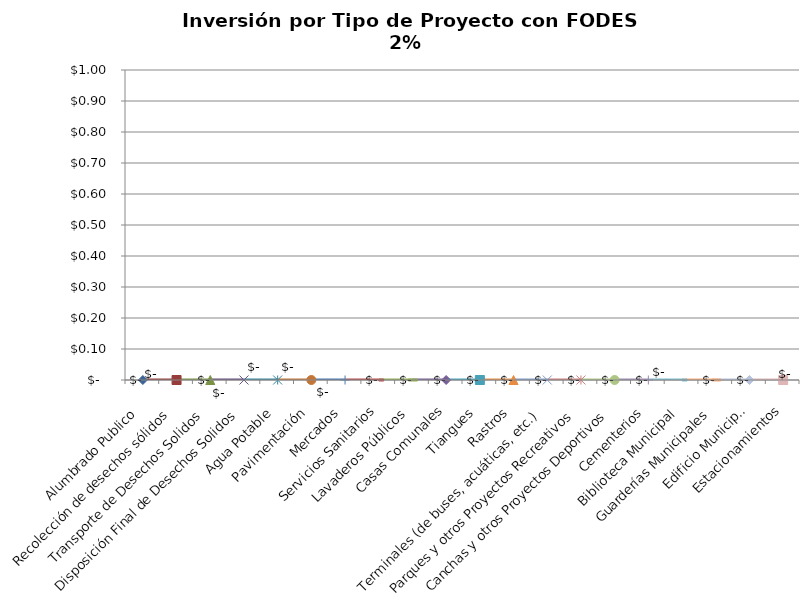
| Category | Series 0 |
|---|---|
| Alumbrado Publico | 0 |
| Recolección de desechos sólidos | 0 |
| Transporte de Desechos Solidos | 0 |
| Disposición Final de Desechos Solidos | 0 |
| Agua Potable | 0 |
| Pavimentación | 0 |
| Mercados | 0 |
| Servicios Sanitarios | 0 |
| Lavaderos Públicos | 0 |
| Casas Comunales | 0 |
| Tiangues | 0 |
| Rastros | 0 |
| Terminales (de buses, acuáticas, etc.) | 0 |
| Parques y otros Proyectos Recreativos | 0 |
| Canchas y otros Proyectos Deportivos | 0 |
| Cementerios | 0 |
| Biblioteca Municipal | 0 |
| Guarderías Municipales | 0 |
| Edificio Municipal | 0 |
| Estacionamientos | 0 |